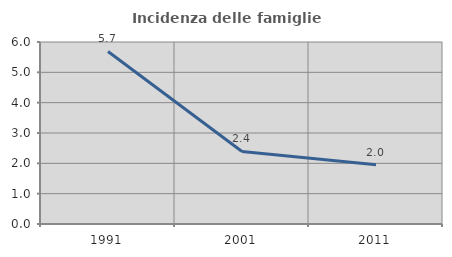
| Category | Incidenza delle famiglie numerose |
|---|---|
| 1991.0 | 5.689 |
| 2001.0 | 2.392 |
| 2011.0 | 1.956 |